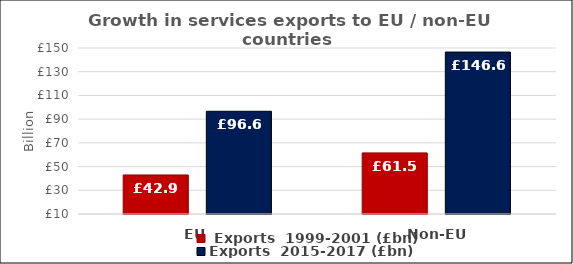
| Category |  Exports  1999-2001 (£bn) | Exports  2015-2017 (£bn) |
|---|---|---|
| EU | 42.936 | 96.626 |
| Non-EU | 61.528 | 146.584 |